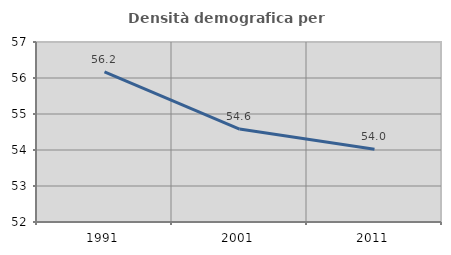
| Category | Densità demografica |
|---|---|
| 1991.0 | 56.172 |
| 2001.0 | 54.582 |
| 2011.0 | 54.023 |